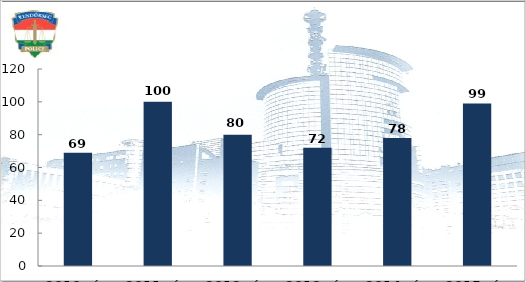
| Category | Személysérüléses közúti közlekedési baleset során meghalt, illetve megsérült személyek száma (fő) |
|---|---|
| 2010. év | 69 |
| 2011. év | 100 |
| 2012. év | 80 |
| 2013. év | 72 |
| 2014. év | 78 |
| 2015. év | 99 |